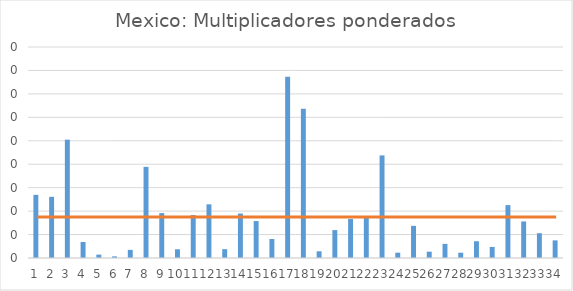
| Category | Series 0 |
|---|---|
| 0 | 0.013 |
| 1 | 0.013 |
| 2 | 0.025 |
| 3 | 0.003 |
| 4 | 0.001 |
| 5 | 0 |
| 6 | 0.002 |
| 7 | 0.019 |
| 8 | 0.01 |
| 9 | 0.002 |
| 10 | 0.009 |
| 11 | 0.011 |
| 12 | 0.002 |
| 13 | 0.009 |
| 14 | 0.008 |
| 15 | 0.004 |
| 16 | 0.039 |
| 17 | 0.032 |
| 18 | 0.001 |
| 19 | 0.006 |
| 20 | 0.008 |
| 21 | 0.009 |
| 22 | 0.022 |
| 23 | 0.001 |
| 24 | 0.007 |
| 25 | 0.001 |
| 26 | 0.003 |
| 27 | 0.001 |
| 28 | 0.004 |
| 29 | 0.002 |
| 30 | 0.011 |
| 31 | 0.008 |
| 32 | 0.005 |
| 33 | 0.004 |